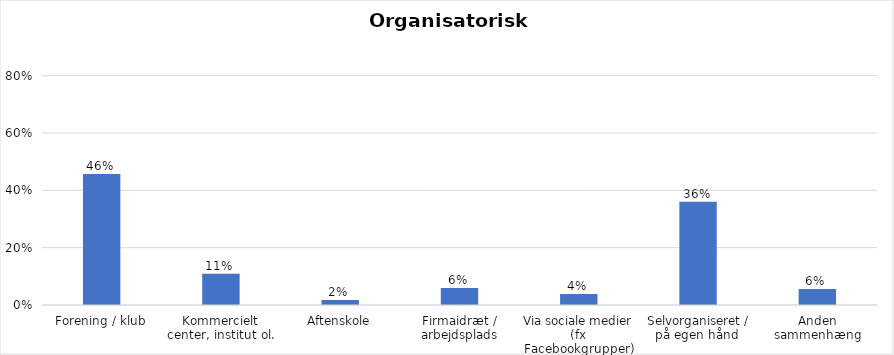
| Category | % |
|---|---|
| Forening / klub | 0.457 |
| Kommercielt center, institut ol. | 0.109 |
| Aftenskole | 0.018 |
| Firmaidræt / arbejdsplads | 0.059 |
| Via sociale medier (fx Facebookgrupper) | 0.038 |
| Selvorganiseret / på egen hånd  | 0.36 |
| Anden sammenhæng | 0.056 |